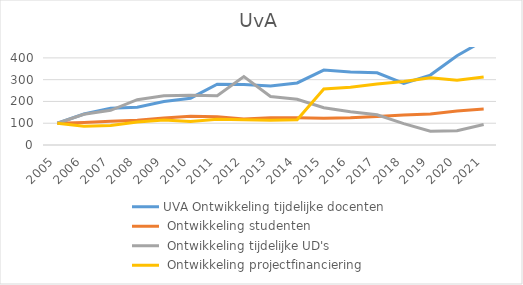
| Category | UVA |
|---|---|
| 2005.0 | 100 |
| 2006.0 | 85.627 |
| 2007.0 | 90.049 |
| 2008.0 | 105.143 |
| 2009.0 | 114.899 |
| 2010.0 | 107.439 |
| 2011.0 | 117.684 |
| 2012.0 | 116.339 |
| 2013.0 | 113.759 |
| 2014.0 | 115.725 |
| 2015.0 | 257.617 |
| 2016.0 | 264.988 |
| 2017.0 | 280.098 |
| 2018.0 | 292.015 |
| 2019.0 | 308.722 |
| 2020.0 | 296.806 |
| 2021.0 | 312.285 |